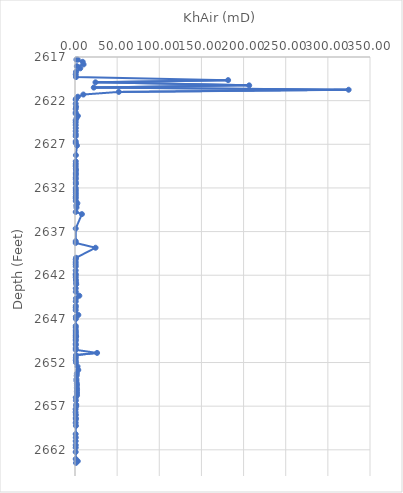
| Category | Series 0 |
|---|---|
| 3.233333333333333 | 2617.3 |
| 1.6375000000000002 | 2617.3 |
| 9.113333333333333 | 2617.55 |
| 10.176666666666668 | 2617.85 |
| 2.183333333333333 | 2618.05 |
| 6.226666666666667 | 2618.3 |
| 1.2366666666666666 | 2618.7 |
| 0.8943333333333333 | 2619 |
| 1.22 | 2619.3 |
| 181.66666666666666 | 2619.65 |
| 24.3 | 2619.9 |
| 206.66666666666666 | 2620.25 |
| 22.266666666666666 | 2620.5 |
| 324.6666666666667 | 2620.75 |
| 51.96666666666666 | 2621 |
| 9.906666666666666 | 2621.3 |
| 3.3433333333333333 | 2621.55 |
| 1.0046666666666666 | 2621.8 |
| 0.8396666666666667 | 2621.9 |
| 0.8353333333333334 | 2622.35 |
| 1.2466666666666668 | 2622.7 |
| 0.847 | 2622.95 |
| 0.8112 | 2623.35 |
| 0.8633333333333333 | 2623.5 |
| 3.4033333333333338 | 2623.75 |
| 1.8433333333333335 | 2624 |
| 0.8276666666666667 | 2624.25 |
| 0.834 | 2624.5 |
| 0.8569999999999999 | 2624.8 |
| 0.9426666666666668 | 2625.15 |
| 0.8450000000000001 | 2625.5 |
| 0.9526666666666667 | 2625.85 |
| 0.8525 | 2626.08 |
| 0.8813333333333334 | 2626.65 |
| 0.8563333333333333 | 2626.85 |
| 2.34 | 2627.15 |
| 1.0866666666666667 | 2628.25 |
| 0.9163333333333333 | 2628.95 |
| 0.8966666666666666 | 2629.25 |
| 0.8356666666666666 | 2629.5 |
| 1.0039999999999998 | 2629.8 |
| 1.1966666666666665 | 2630 |
| 0.9806666666666667 | 2630.3 |
| 1.0199999999999998 | 2630.5 |
| 0.9086666666666666 | 2630.8 |
| 0.89 | 2631 |
| 0.989 | 2631.35 |
| 1.0066666666666668 | 2631.55 |
| 0.8643333333333333 | 2632 |
| 0.9736666666666666 | 2632.25 |
| 0.9546666666666667 | 2632.5 |
| 0.9940000000000001 | 2632.75 |
| 0.8953333333333333 | 2633 |
| 0.8923333333333333 | 2633.2 |
| 0.9193333333333333 | 2633.5 |
| 2.8266666666666667 | 2633.75 |
| 1.5866666666666667 | 2634 |
| 1.7666666666666668 | 2634.25 |
| 0.8766666666666666 | 2634.75 |
| 8.176666666666666 | 2635 |
| 0.863 | 2636.65 |
| 0.8576666666666667 | 2638.1 |
| 0.8586666666666667 | 2638.3 |
| 24.400000000000002 | 2638.85 |
| 1.26 | 2640 |
| 0.8530000000000001 | 2640.2 |
| 0.847 | 2640.5 |
| 0.8243333333333333 | 2640.75 |
| 0.8813333333333334 | 2641 |
| 0.8426666666666667 | 2641.45 |
| 0.8563333333333333 | 2641.85 |
| 0.8673333333333333 | 2642 |
| 0.8696666666666667 | 2642.25 |
| 1.07 | 2642.55 |
| 1.2866666666666666 | 2642.85 |
| 1.4875 | 2643.05 |
| 0.9043333333333333 | 2643.5 |
| 0.9676666666666668 | 2643.9 |
| 5.14 | 2644.35 |
| 1.1466666666666667 | 2644.65 |
| 0.903 | 2645 |
| 0.973 | 2645.5 |
| 0.87 | 2645.7 |
| 0.858 | 2646 |
| 3.9633333333333334 | 2646.55 |
| 1.0156666666666667 | 2646.75 |
| 1.039 | 2647 |
| 0.8676666666666666 | 2647.8 |
| 0.9013333333333332 | 2648 |
| 0.9103333333333333 | 2648.3 |
| 0.9183333333333333 | 2648.5 |
| 0.9643333333333333 | 2648.7 |
| 0.8856666666666667 | 2648.9 |
| 1.3233333333333335 | 2649 |
| 0.8743333333333334 | 2649.1 |
| 0.8786666666666667 | 2649.35 |
| 0.9286666666666666 | 2649.5 |
| 0.8479999999999999 | 2649.85 |
| 0.9486666666666667 | 2650 |
| 0.875 | 2650.35 |
| 0.8743333333333334 | 2650.55 |
| 26.2 | 2650.9 |
| 1.2 | 2651.15 |
| 1.0203333333333333 | 2651.45 |
| 0.904 | 2651.75 |
| 1.1333333333333335 | 2652 |
| 2.9966666666666666 | 2652.45 |
| 3.9 | 2652.85 |
| 2.233333333333333 | 2653.25 |
| 2.0066666666666664 | 2653.5 |
| 1.7066666666666668 | 2653.9 |
| 1.7366666666666666 | 2654.1 |
| 2.233333333333334 | 2654.4 |
| 2.276666666666667 | 2654.6 |
| 2.1966666666666668 | 2654.9 |
| 2.4133333333333336 | 2655.1 |
| 2.2133333333333334 | 2655.3 |
| 2.3366666666666664 | 2655.5 |
| 2.4266666666666663 | 2655.75 |
| 0.9223333333333334 | 2656 |
| 1.0933333333333335 | 2656.35 |
| 1.43 | 2656.82 |
| 1.4766666666666666 | 2657 |
| 0.754 | 2657.35 |
| 0.7266666666666667 | 2657.7 |
| 1.0063333333333333 | 2658 |
| 0.8943333333333333 | 2658.35 |
| 1.0566666666666669 | 2658.5 |
| 0.8216666666666667 | 2658.9 |
| 1.1233333333333333 | 2659.25 |
| 0.8056666666666666 | 2660.2 |
| 0.9289999999999999 | 2660.6 |
| 0.8346666666666667 | 2661 |
| 0.8513333333333334 | 2661.45 |
| 0.8393333333333333 | 2661.75 |
| 0.8093333333333333 | 2662.25 |
| 0.8523333333333333 | 2663.05 |
| 3.285333333333334 | 2663.3 |
| 1.1733333333333333 | 2663.5 |